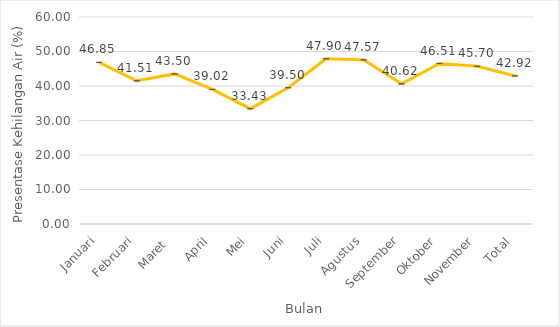
| Category | Kehilangan Air (%) |
|---|---|
| Januari | 46.852 |
| Februari | 41.507 |
| Maret  | 43.5 |
| April | 39.015 |
| Mei | 33.425 |
| Juni | 39.505 |
| Juli | 47.903 |
| Agustus | 47.573 |
| September | 40.617 |
| Oktober | 46.514 |
| November | 45.703 |
| Total | 42.92 |